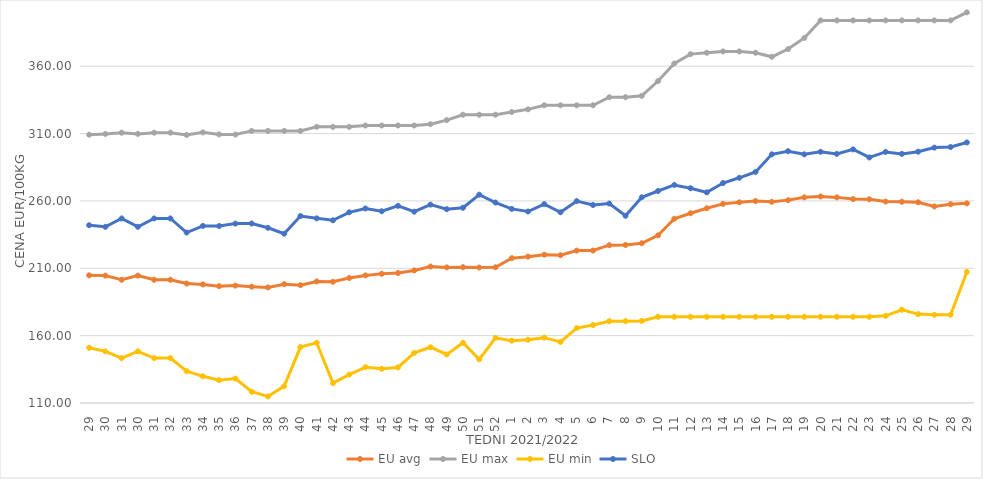
| Category | EU avg | EU max | EU min | SLO |
|---|---|---|---|---|
| 29.0 | 204.773 | 309.15 | 151.052 | 241.96 |
| 30.0 | 204.558 | 309.78 | 148.33 | 240.79 |
| 31.0 | 201.483 | 310.67 | 143.33 | 247 |
| 30.0 | 204.558 | 309.78 | 148.33 | 240.79 |
| 31.0 | 201.483 | 310.67 | 143.33 | 247 |
| 32.0 | 201.483 | 310.67 | 143.33 | 247 |
| 33.0 | 198.691 | 309 | 133.607 | 236.54 |
| 34.0 | 198.027 | 310.9 | 129.797 | 241.45 |
| 35.0 | 196.72 | 309.41 | 126.926 | 241.39 |
| 36.0 | 197.157 | 309.28 | 128.099 | 243.19 |
| 37.0 | 196.375 | 312 | 118.364 | 243.28 |
| 38.0 | 195.821 | 312 | 114.892 | 240.06 |
| 39.0 | 198.179 | 312 | 122.517 | 235.66 |
| 40.0 | 197.482 | 312 | 151.488 | 248.77 |
| 41.0 | 200.22 | 315 | 154.74 | 247.07 |
| 42.0 | 199.965 | 315 | 124.748 | 245.64 |
| 43.0 | 202.804 | 315 | 131.104 | 251.53 |
| 44.0 | 204.713 | 316 | 136.6 | 254.42 |
| 45.0 | 205.906 | 316 | 135.362 | 252.35 |
| 46.0 | 206.476 | 316 | 136.39 | 256.33 |
| 47.0 | 208.415 | 316 | 147.192 | 252.01 |
| 48.0 | 211.314 | 317 | 151.41 | 257.25 |
| 49.0 | 210.677 | 320 | 146.064 | 253.87 |
| 50.0 | 210.823 | 324 | 154.698 | 254.94 |
| 51.0 | 210.59 | 324 | 142.382 | 264.65 |
| 52.0 | 210.763 | 324 | 158.333 | 258.8 |
| 1.0 | 217.519 | 326 | 156.222 | 254.09 |
| 2.0 | 218.654 | 328 | 156.969 | 252.15 |
| 3.0 | 220.098 | 331 | 158.511 | 257.65 |
| 4.0 | 219.685 | 331 | 155.346 | 251.6 |
| 5.0 | 223.143 | 331 | 165.59 | 259.87 |
| 6.0 | 223.178 | 331 | 167.86 | 256.97 |
| 7.0 | 227.145 | 337 | 170.719 | 258.07 |
| 8.0 | 227.312 | 337 | 170.743 | 248.97 |
| 9.0 | 228.588 | 338 | 170.92 | 262.72 |
| 10.0 | 234.434 | 349 | 174 | 267.38 |
| 11.0 | 246.762 | 362 | 174 | 271.86 |
| 12.0 | 250.845 | 369 | 174 | 269.43 |
| 13.0 | 254.568 | 370 | 174 | 266.39 |
| 14.0 | 257.819 | 371 | 174 | 273.3 |
| 15.0 | 259 | 371 | 174 | 277.18 |
| 16.0 | 259.873 | 370 | 174 | 281.55 |
| 17.0 | 259.351 | 367 | 174 | 294.59 |
| 18.0 | 260.6 | 372.758 | 174 | 296.93 |
| 19.0 | 262.669 | 381 | 174 | 294.6 |
| 20.0 | 263.291 | 394 | 174 | 296.48 |
| 21.0 | 262.64 | 394 | 174 | 294.94 |
| 22.0 | 261.388 | 394 | 174 | 298.26 |
| 23.0 | 261.228 | 394 | 174 | 292.27 |
| 24.0 | 259.544 | 394 | 174.72 | 296.39 |
| 25.0 | 259.395 | 394 | 179.2 | 294.93 |
| 26.0 | 259.018 | 394 | 176 | 296.56 |
| 27.0 | 255.922 | 394 | 175.451 | 299.59 |
| 28.0 | 257.569 | 394 | 175.52 | 300.01 |
| 29.0 | 258.208 | 400 | 207.296 | 303.41 |